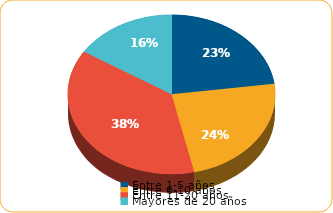
| Category | Series 0 |
|---|---|
| Entre 1-5 años | 3264 |
| Entre 6-10 años | 3373.1 |
| Entre 11-20 años | 5355.5 |
| Mayores de 20 años | 2284.7 |